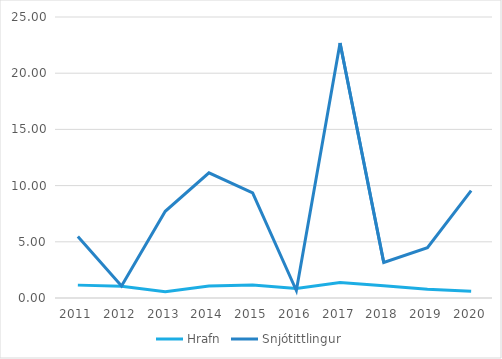
| Category | Hrafn | Snjótittlingur |
|---|---|---|
| 2011.0 | 1.145 | 5.466 |
| 2012.0 | 1.043 | 1.07 |
| 2013.0 | 0.559 | 7.718 |
| 2014.0 | 1.077 | 11.141 |
| 2015.0 | 1.157 | 9.356 |
| 2016.0 | 0.84 | 0.668 |
| 2017.0 | 1.379 | 22.692 |
| 2018.0 | 1.095 | 3.16 |
| 2019.0 | 0.775 | 4.472 |
| 2020.0 | 0.601 | 9.558 |